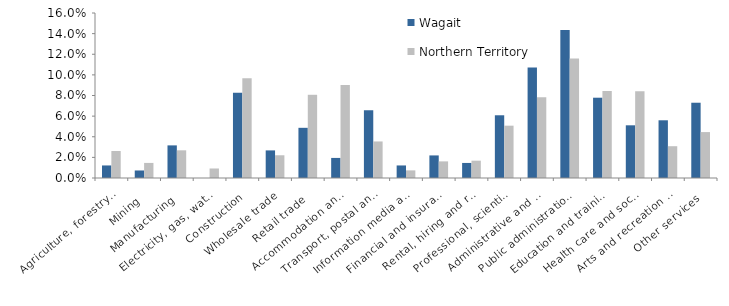
| Category | Wagait | Northern Territory |
|---|---|---|
| Agriculture, forestry and fishing | 0.012 | 0.026 |
| Mining | 0.007 | 0.015 |
| Manufacturing | 0.032 | 0.027 |
| Electricity, gas, water and waste services | 0 | 0.009 |
| Construction | 0.083 | 0.097 |
| Wholesale trade | 0.027 | 0.022 |
| Retail trade | 0.049 | 0.081 |
| Accommodation and food services | 0.019 | 0.09 |
| Transport, postal and warehousing | 0.066 | 0.035 |
| Information media and telecommunications | 0.012 | 0.007 |
| Financial and insurance services | 0.022 | 0.016 |
| Rental, hiring and real estate services | 0.015 | 0.017 |
| Professional, scientific and technical services | 0.061 | 0.051 |
| Administrative and support services | 0.107 | 0.078 |
| Public administration and safety | 0.144 | 0.116 |
| Education and training | 0.078 | 0.084 |
| Health care and social assistance | 0.051 | 0.084 |
| Arts and recreation services | 0.056 | 0.031 |
| Other services | 0.073 | 0.045 |